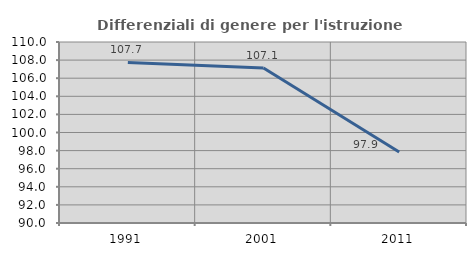
| Category | Differenziali di genere per l'istruzione superiore |
|---|---|
| 1991.0 | 107.741 |
| 2001.0 | 107.126 |
| 2011.0 | 97.854 |